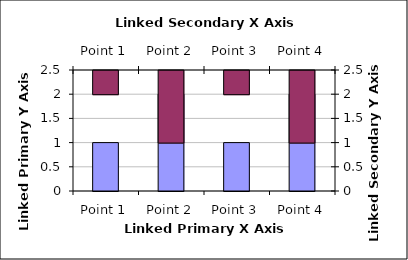
| Category | Series 1 |
|---|---|
| Point 1 | 1 |
| Point 2 | 2 |
| Point 3 | 1 |
| Point 4 | 2 |